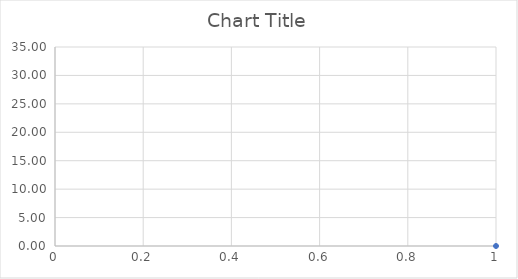
| Category | Series 0 |
|---|---|
| 0 | 0 |
| 1 | 4.007 |
| 2 | 3.002 |
| 3 | 4.172 |
| 4 | 5.581 |
| 5 | 7.334 |
| 6 | 7.56 |
| 7 | 9.856 |
| 8 | 10.087 |
| 9 | 10.22 |
| 10 | 11.398 |
| 11 | 12.667 |
| 12 | 13.556 |
| 13 | 13.73 |
| 14 | 14.295 |
| 15 | 12.141 |
| 16 | 14.742 |
| 17 | 14.778 |
| 18 | 13.005 |
| 19 | 13.746 |
| 20 | 14.672 |
| 21 | 14.283 |
| 22 | 14.325 |
| 23 | 14.709 |
| 24 | 14.762 |
| 25 | 15.876 |
| 26 | 15.704 |
| 27 | 17.011 |
| 28 | 16.409 |
| 29 | 16.69 |
| 30 | 17.223 |
| 31 | 16.727 |
| 32 | 16.519 |
| 33 | 16.436 |
| 34 | 15.158 |
| 35 | 17.117 |
| 36 | 16.537 |
| 37 | 17.952 |
| 38 | 17.148 |
| 39 | 19.07 |
| 40 | 18.573 |
| 41 | 18.124 |
| 42 | 19.188 |
| 43 | 17.679 |
| 44 | 16.967 |
| 45 | 17.099 |
| 46 | 19.308 |
| 47 | 18.87 |
| 48 | 19.261 |
| 49 | 18.833 |
| 50 | 17.57 |
| 51 | 17.019 |
| 52 | 17.775 |
| 53 | 19.152 |
| 54 | 16.242 |
| 55 | 16.841 |
| 56 | 19.283 |
| 57 | 19.032 |
| 58 | 18.865 |
| 59 | 17.029 |
| 60 | 17.508 |
| 61 | 18.999 |
| 62 | 17.038 |
| 63 | 18.829 |
| 64 | 18.949 |
| 65 | 20.058 |
| 66 | 19.386 |
| 67 | 19.398 |
| 68 | 18.701 |
| 69 | 18.666 |
| 70 | 17.645 |
| 71 | 18.496 |
| 72 | 20.429 |
| 73 | 19.578 |
| 74 | 18.917 |
| 75 | 19.33 |
| 76 | 19.278 |
| 77 | 19.747 |
| 78 | 19.056 |
| 79 | 19.187 |
| 80 | 18.241 |
| 81 | 19.42 |
| 82 | 19.847 |
| 83 | 18.757 |
| 84 | 20.508 |
| 85 | 20.947 |
| 86 | 20.407 |
| 87 | 19.674 |
| 88 | 18.753 |
| 89 | 19.654 |
| 90 | 20.254 |
| 91 | 20.016 |
| 92 | 20.318 |
| 93 | 20.413 |
| 94 | 19.001 |
| 95 | 20.296 |
| 96 | 20.063 |
| 97 | 19.212 |
| 98 | 20.529 |
| 99 | 19.857 |
| 100 | 20.214 |
| 101 | 19.967 |
| 102 | 20.404 |
| 103 | 20.51 |
| 104 | 20.466 |
| 105 | 21.049 |
| 106 | 20.437 |
| 107 | 21.351 |
| 108 | 21.783 |
| 109 | 22.451 |
| 110 | 22.92 |
| 111 | 22.073 |
| 112 | 21.143 |
| 113 | 20.278 |
| 114 | 20.477 |
| 115 | 20.692 |
| 116 | 20.768 |
| 117 | 20.78 |
| 118 | 21.196 |
| 119 | 23.821 |
| 120 | 22.294 |
| 121 | 23.494 |
| 122 | 21.552 |
| 123 | 21.613 |
| 124 | 22.994 |
| 125 | 22.926 |
| 126 | 22.448 |
| 127 | 22.399 |
| 128 | 23.234 |
| 129 | 22.857 |
| 130 | 23.195 |
| 131 | 24.102 |
| 132 | 23.43 |
| 133 | 23.427 |
| 134 | 22.927 |
| 135 | 22.741 |
| 136 | 23.449 |
| 137 | 22.992 |
| 138 | 23.997 |
| 139 | 22.936 |
| 140 | 23.981 |
| 141 | 22.843 |
| 142 | 22.214 |
| 143 | 23.201 |
| 144 | 22.169 |
| 145 | 22.33 |
| 146 | 23.436 |
| 147 | 23.39 |
| 148 | 23.559 |
| 149 | 23.056 |
| 150 | 22.656 |
| 151 | 23.811 |
| 152 | 23.652 |
| 153 | 23.368 |
| 154 | 24.202 |
| 155 | 24.293 |
| 156 | 23.036 |
| 157 | 24.256 |
| 158 | 24.42 |
| 159 | 24.254 |
| 160 | 24.339 |
| 161 | 25.666 |
| 162 | 24.477 |
| 163 | 24.876 |
| 164 | 22.897 |
| 165 | 22.767 |
| 166 | 24.915 |
| 167 | 25.584 |
| 168 | 24.631 |
| 169 | 24.329 |
| 170 | 25.432 |
| 171 | 24.262 |
| 172 | 24.554 |
| 173 | 24.924 |
| 174 | 24.564 |
| 175 | 23.639 |
| 176 | 23.626 |
| 177 | 24.333 |
| 178 | 23.132 |
| 179 | 24.658 |
| 180 | 23.294 |
| 181 | 22.827 |
| 182 | 23.515 |
| 183 | 24.057 |
| 184 | 24.749 |
| 185 | 24.206 |
| 186 | 25.29 |
| 187 | 24.298 |
| 188 | 24.151 |
| 189 | 24.187 |
| 190 | 25.558 |
| 191 | 26.506 |
| 192 | 25.134 |
| 193 | 24.638 |
| 194 | 24.925 |
| 195 | 25.223 |
| 196 | 25.695 |
| 197 | 24.765 |
| 198 | 25.929 |
| 199 | 25.97 |
| 200 | 24.35 |
| 201 | 24.482 |
| 202 | 24.267 |
| 203 | 25.371 |
| 204 | 26.199 |
| 205 | 26.357 |
| 206 | 26.035 |
| 207 | 26.957 |
| 208 | 26.126 |
| 209 | 26.324 |
| 210 | 26.442 |
| 211 | 26.607 |
| 212 | 25.727 |
| 213 | 25.914 |
| 214 | 26.687 |
| 215 | 26.362 |
| 216 | 25.819 |
| 217 | 25.253 |
| 218 | 24.63 |
| 219 | 25.319 |
| 220 | 25.463 |
| 221 | 25.784 |
| 222 | 24.944 |
| 223 | 25.114 |
| 224 | 24.432 |
| 225 | 25.069 |
| 226 | 26.082 |
| 227 | 26.431 |
| 228 | 25.478 |
| 229 | 25.808 |
| 230 | 25.385 |
| 231 | 25.069 |
| 232 | 25.26 |
| 233 | 26.033 |
| 234 | 24.646 |
| 235 | 25.616 |
| 236 | 25.729 |
| 237 | 26.188 |
| 238 | 26.607 |
| 239 | 26.01 |
| 240 | 26.325 |
| 241 | 26.048 |
| 242 | 25.369 |
| 243 | 27.209 |
| 244 | 25.659 |
| 245 | 26.239 |
| 246 | 26.041 |
| 247 | 24.803 |
| 248 | 26.512 |
| 249 | 25.479 |
| 250 | 25.823 |
| 251 | 24.122 |
| 252 | 26.2 |
| 253 | 27.182 |
| 254 | 26.677 |
| 255 | 26.14 |
| 256 | 24.21 |
| 257 | 25.414 |
| 258 | 26.144 |
| 259 | 25.261 |
| 260 | 25.752 |
| 261 | 25.565 |
| 262 | 26.758 |
| 263 | 26.612 |
| 264 | 25.873 |
| 265 | 27.29 |
| 266 | 26.85 |
| 267 | 26.125 |
| 268 | 27.057 |
| 269 | 26.736 |
| 270 | 26.255 |
| 271 | 26.189 |
| 272 | 27.406 |
| 273 | 26.492 |
| 274 | 26.05 |
| 275 | 23.704 |
| 276 | 25.815 |
| 277 | 25.59 |
| 278 | 25.151 |
| 279 | 24.41 |
| 280 | 25.745 |
| 281 | 26.488 |
| 282 | 27.328 |
| 283 | 25.885 |
| 284 | 26.893 |
| 285 | 26.333 |
| 286 | 26.844 |
| 287 | 26.452 |
| 288 | 24.548 |
| 289 | 26.45 |
| 290 | 26.08 |
| 291 | 26.736 |
| 292 | 26.443 |
| 293 | 26.465 |
| 294 | 25.926 |
| 295 | 24.175 |
| 296 | 26.357 |
| 297 | 24.611 |
| 298 | 24.055 |
| 299 | 24.883 |
| 300 | 25.644 |
| 301 | 26.821 |
| 302 | 23.857 |
| 303 | 24.635 |
| 304 | 24.014 |
| 305 | 24.621 |
| 306 | 25.03 |
| 307 | 26.428 |
| 308 | 26.002 |
| 309 | 25.723 |
| 310 | 26.17 |
| 311 | 26.873 |
| 312 | 26.98 |
| 313 | 26.731 |
| 314 | 27.235 |
| 315 | 26.47 |
| 316 | 25.755 |
| 317 | 26.836 |
| 318 | 26.384 |
| 319 | 25.427 |
| 320 | 25.44 |
| 321 | 26.669 |
| 322 | 25.637 |
| 323 | 26.57 |
| 324 | 25.086 |
| 325 | 25.776 |
| 326 | 24.197 |
| 327 | 25.698 |
| 328 | 27.259 |
| 329 | 26.598 |
| 330 | 25.449 |
| 331 | 25.066 |
| 332 | 25.819 |
| 333 | 26.54 |
| 334 | 27.813 |
| 335 | 26.045 |
| 336 | 25.336 |
| 337 | 25.612 |
| 338 | 26.706 |
| 339 | 26.335 |
| 340 | 26.193 |
| 341 | 26.478 |
| 342 | 26.411 |
| 343 | 26.459 |
| 344 | 25.902 |
| 345 | 27.189 |
| 346 | 25.95 |
| 347 | 26.02 |
| 348 | 26.612 |
| 349 | 27.623 |
| 350 | 26.43 |
| 351 | 26.128 |
| 352 | 26.081 |
| 353 | 27.3 |
| 354 | 27.151 |
| 355 | 26.399 |
| 356 | 27.297 |
| 357 | 26.567 |
| 358 | 26.12 |
| 359 | 26.486 |
| 360 | 25.833 |
| 361 | 26.934 |
| 362 | 25.87 |
| 363 | 27.349 |
| 364 | 25.73 |
| 365 | 26.573 |
| 366 | 27.524 |
| 367 | 26.222 |
| 368 | 26.811 |
| 369 | 27.982 |
| 370 | 27.392 |
| 371 | 24.782 |
| 372 | 26.304 |
| 373 | 27.229 |
| 374 | 27.304 |
| 375 | 27.346 |
| 376 | 26.668 |
| 377 | 28.043 |
| 378 | 28.806 |
| 379 | 25.765 |
| 380 | 27.149 |
| 381 | 26.443 |
| 382 | 26.801 |
| 383 | 26.361 |
| 384 | 25.942 |
| 385 | 26.305 |
| 386 | 26.551 |
| 387 | 25.972 |
| 388 | 26.73 |
| 389 | 27.883 |
| 390 | 27.314 |
| 391 | 26.492 |
| 392 | 26.02 |
| 393 | 27.145 |
| 394 | 26.192 |
| 395 | 27.303 |
| 396 | 25.568 |
| 397 | 25.092 |
| 398 | 25.369 |
| 399 | 25.519 |
| 400 | 25.944 |
| 401 | 25.986 |
| 402 | 24.827 |
| 403 | 26.003 |
| 404 | 26.034 |
| 405 | 27.013 |
| 406 | 26.041 |
| 407 | 26.378 |
| 408 | 25.741 |
| 409 | 25.062 |
| 410 | 26.504 |
| 411 | 26.588 |
| 412 | 25.784 |
| 413 | 26.935 |
| 414 | 27.94 |
| 415 | 27.719 |
| 416 | 27.162 |
| 417 | 27.764 |
| 418 | 27.951 |
| 419 | 28.476 |
| 420 | 28.047 |
| 421 | 28.362 |
| 422 | 27.819 |
| 423 | 26.77 |
| 424 | 26.121 |
| 425 | 27.553 |
| 426 | 26.883 |
| 427 | 26.636 |
| 428 | 26.787 |
| 429 | 26.507 |
| 430 | 27.428 |
| 431 | 27.011 |
| 432 | 25.319 |
| 433 | 26.858 |
| 434 | 26.867 |
| 435 | 25.878 |
| 436 | 25.64 |
| 437 | 25.664 |
| 438 | 26.168 |
| 439 | 26.028 |
| 440 | 27.533 |
| 441 | 27.146 |
| 442 | 28.042 |
| 443 | 27.059 |
| 444 | 27.463 |
| 445 | 28.05 |
| 446 | 26.437 |
| 447 | 27.005 |
| 448 | 27.018 |
| 449 | 27.056 |
| 450 | 27.328 |
| 451 | 27.482 |
| 452 | 26.927 |
| 453 | 28.466 |
| 454 | 27.604 |
| 455 | 27.843 |
| 456 | 27.403 |
| 457 | 26.748 |
| 458 | 26.76 |
| 459 | 26.597 |
| 460 | 26.61 |
| 461 | 27.895 |
| 462 | 26.87 |
| 463 | 27.717 |
| 464 | 26.882 |
| 465 | 27.449 |
| 466 | 26.147 |
| 467 | 27.166 |
| 468 | 26.132 |
| 469 | 25.664 |
| 470 | 25.436 |
| 471 | 26.986 |
| 472 | 27.448 |
| 473 | 26.946 |
| 474 | 26.745 |
| 475 | 28.064 |
| 476 | 25.741 |
| 477 | 26.179 |
| 478 | 27.285 |
| 479 | 26.304 |
| 480 | 25.699 |
| 481 | 25.26 |
| 482 | 27.248 |
| 483 | 25.078 |
| 484 | 27.635 |
| 485 | 26.848 |
| 486 | 25.324 |
| 487 | 27.124 |
| 488 | 27.53 |
| 489 | 26.27 |
| 490 | 26.571 |
| 491 | 26.946 |
| 492 | 27.199 |
| 493 | 27.433 |
| 494 | 27.258 |
| 495 | 26.72 |
| 496 | 25.596 |
| 497 | 25.674 |
| 498 | 25.198 |
| 499 | 25.767 |
| 500 | 26.69 |
| 501 | 25.496 |
| 502 | 25.783 |
| 503 | 26.611 |
| 504 | 25.324 |
| 505 | 25.168 |
| 506 | 25.651 |
| 507 | 27.729 |
| 508 | 27.354 |
| 509 | 26.291 |
| 510 | 25.818 |
| 511 | 27.529 |
| 512 | 28.24 |
| 513 | 28.446 |
| 514 | 30.043 |
| 515 | 29.679 |
| 516 | 28.416 |
| 517 | 27.53 |
| 518 | 28.403 |
| 519 | 25.744 |
| 520 | 27.014 |
| 521 | 25.84 |
| 522 | 26.922 |
| 523 | 26.273 |
| 524 | 27.425 |
| 525 | 27.671 |
| 526 | 26.973 |
| 527 | 26.879 |
| 528 | 28.271 |
| 529 | 27.178 |
| 530 | 27.872 |
| 531 | 26.685 |
| 532 | 26.533 |
| 533 | 26.679 |
| 534 | 27.074 |
| 535 | 27.405 |
| 536 | 28.632 |
| 537 | 27.306 |
| 538 | 27.998 |
| 539 | 26.273 |
| 540 | 27.625 |
| 541 | 27.347 |
| 542 | 27.34 |
| 543 | 27.899 |
| 544 | 27.452 |
| 545 | 27.256 |
| 546 | 28.167 |
| 547 | 27.374 |
| 548 | 28.317 |
| 549 | 27.991 |
| 550 | 28.49 |
| 551 | 28.025 |
| 552 | 28.155 |
| 553 | 27.166 |
| 554 | 27.301 |
| 555 | 28.007 |
| 556 | 26.594 |
| 557 | 27.402 |
| 558 | 27.311 |
| 559 | 26.436 |
| 560 | 28.009 |
| 561 | 27.262 |
| 562 | 27.236 |
| 563 | 27.896 |
| 564 | 25.759 |
| 565 | 26.3 |
| 566 | 26.949 |
| 567 | 27.236 |
| 568 | 28.095 |
| 569 | 27.562 |
| 570 | 26.537 |
| 571 | 27.898 |
| 572 | 26.608 |
| 573 | 27.25 |
| 574 | 25.587 |
| 575 | 26.525 |
| 576 | 28.289 |
| 577 | 27.456 |
| 578 | 28.526 |
| 579 | 26.882 |
| 580 | 28.084 |
| 581 | 27.272 |
| 582 | 26.461 |
| 583 | 26.583 |
| 584 | 27.085 |
| 585 | 28.187 |
| 586 | 27.438 |
| 587 | 27.65 |
| 588 | 27.449 |
| 589 | 27.05 |
| 590 | 29.104 |
| 591 | 27.84 |
| 592 | 26.939 |
| 593 | 26.792 |
| 594 | 28.12 |
| 595 | 28.573 |
| 596 | 26.784 |
| 597 | 25.515 |
| 598 | 26.884 |
| 599 | 25.529 |
| 600 | 25.497 |
| 601 | 24.242 |
| 602 | 25.042 |
| 603 | 24.166 |
| 604 | 23.245 |
| 605 | 23.999 |
| 606 | 22.987 |
| 607 | 21.699 |
| 608 | 21.309 |
| 609 | 21.871 |
| 610 | 24.047 |
| 611 | 22.649 |
| 612 | 22.106 |
| 613 | 22.278 |
| 614 | 22.071 |
| 615 | 22.435 |
| 616 | 23.586 |
| 617 | 22.799 |
| 618 | 22.808 |
| 619 | 22.683 |
| 620 | 21.41 |
| 621 | 20.788 |
| 622 | 23.179 |
| 623 | 22.676 |
| 624 | 22.465 |
| 625 | 20.967 |
| 626 | 20.9 |
| 627 | 21.109 |
| 628 | 20.231 |
| 629 | 20.242 |
| 630 | 20.077 |
| 631 | 20.533 |
| 632 | 20.459 |
| 633 | 20.186 |
| 634 | 19.441 |
| 635 | 19.675 |
| 636 | 19.994 |
| 637 | 20.117 |
| 638 | 18.272 |
| 639 | 19.711 |
| 640 | 17.817 |
| 641 | 18.451 |
| 642 | 19.49 |
| 643 | 19.756 |
| 644 | 18.99 |
| 645 | 19.426 |
| 646 | 19.818 |
| 647 | 18.357 |
| 648 | 19.365 |
| 649 | 19.288 |
| 650 | 19.172 |
| 651 | 18.502 |
| 652 | 17.789 |
| 653 | 19.266 |
| 654 | 20.546 |
| 655 | 18.13 |
| 656 | 19.509 |
| 657 | 18.961 |
| 658 | 18.948 |
| 659 | 18.219 |
| 660 | 18.904 |
| 661 | 17.5 |
| 662 | 18.668 |
| 663 | 17.719 |
| 664 | 18.22 |
| 665 | 18.87 |
| 666 | 16.798 |
| 667 | 17.867 |
| 668 | 17.316 |
| 669 | 17.769 |
| 670 | 17.571 |
| 671 | 17.711 |
| 672 | 17.203 |
| 673 | 17.8 |
| 674 | 17.674 |
| 675 | 16.044 |
| 676 | 16.903 |
| 677 | 15.657 |
| 678 | 16.267 |
| 679 | 16.711 |
| 680 | 16.522 |
| 681 | 15.989 |
| 682 | 16.553 |
| 683 | 16.661 |
| 684 | 15.943 |
| 685 | 15.521 |
| 686 | 16.368 |
| 687 | 14.584 |
| 688 | 16.212 |
| 689 | 15.435 |
| 690 | 16.659 |
| 691 | 15.99 |
| 692 | 15.651 |
| 693 | 15.65 |
| 694 | 16.119 |
| 695 | 15.407 |
| 696 | 17.125 |
| 697 | 15.761 |
| 698 | 15.272 |
| 699 | 15.731 |
| 700 | 16.992 |
| 701 | 16.592 |
| 702 | 13.442 |
| 703 | 15.027 |
| 704 | 14.265 |
| 705 | 15.437 |
| 706 | 15.247 |
| 707 | 15.4 |
| 708 | 15.848 |
| 709 | 14.756 |
| 710 | 15.875 |
| 711 | 15.853 |
| 712 | 14.87 |
| 713 | 15.721 |
| 714 | 14.381 |
| 715 | 14.962 |
| 716 | 15.421 |
| 717 | 16.198 |
| 718 | 15.427 |
| 719 | 14.824 |
| 720 | 14.402 |
| 721 | 15.135 |
| 722 | 15.574 |
| 723 | 14.69 |
| 724 | 14.062 |
| 725 | 15.438 |
| 726 | 14.4 |
| 727 | 13.973 |
| 728 | 12.883 |
| 729 | 14.603 |
| 730 | 13.807 |
| 731 | 14.249 |
| 732 | 15.048 |
| 733 | 14.98 |
| 734 | 15.249 |
| 735 | 14.688 |
| 736 | 14.794 |
| 737 | 14.527 |
| 738 | 12.498 |
| 739 | 14.11 |
| 740 | 13.838 |
| 741 | 14.467 |
| 742 | 14.277 |
| 743 | 13.799 |
| 744 | 13.224 |
| 745 | 12.344 |
| 746 | 12.622 |
| 747 | 13.298 |
| 748 | 12.047 |
| 749 | 14.549 |
| 750 | 13.786 |
| 751 | 13.343 |
| 752 | 12.759 |
| 753 | 12.446 |
| 754 | 14.142 |
| 755 | 13.373 |
| 756 | 12.547 |
| 757 | 13.36 |
| 758 | 12.703 |
| 759 | 14.796 |
| 760 | 13.004 |
| 761 | 13.56 |
| 762 | 12.666 |
| 763 | 11.993 |
| 764 | 12.131 |
| 765 | 13.08 |
| 766 | 12.408 |
| 767 | 12.517 |
| 768 | 12.954 |
| 769 | 11.928 |
| 770 | 12.255 |
| 771 | 12.974 |
| 772 | 12.683 |
| 773 | 12.078 |
| 774 | 12.755 |
| 775 | 12.542 |
| 776 | 11.159 |
| 777 | 12.251 |
| 778 | 12.068 |
| 779 | 12.359 |
| 780 | 12.669 |
| 781 | 12.421 |
| 782 | 11.861 |
| 783 | 12.569 |
| 784 | 11.594 |
| 785 | 12.095 |
| 786 | 12.131 |
| 787 | 12.775 |
| 788 | 12.708 |
| 789 | 11.378 |
| 790 | 11.336 |
| 791 | 12.822 |
| 792 | 13.016 |
| 793 | 12.65 |
| 794 | 13.379 |
| 795 | 12.758 |
| 796 | 12.344 |
| 797 | 12.078 |
| 798 | 11.194 |
| 799 | 10.248 |